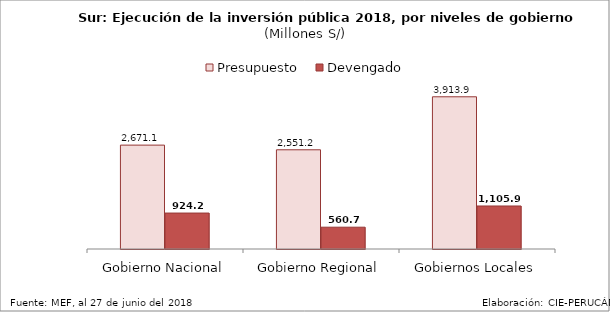
| Category | Presupuesto | Devengado |
|---|---|---|
| Gobierno Nacional | 2671.088 | 924.203 |
| Gobierno Regional | 2551.245 | 560.744 |
| Gobiernos Locales | 3913.878 | 1105.883 |